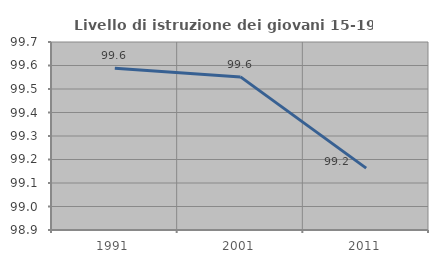
| Category | Livello di istruzione dei giovani 15-19 anni |
|---|---|
| 1991.0 | 99.588 |
| 2001.0 | 99.552 |
| 2011.0 | 99.163 |